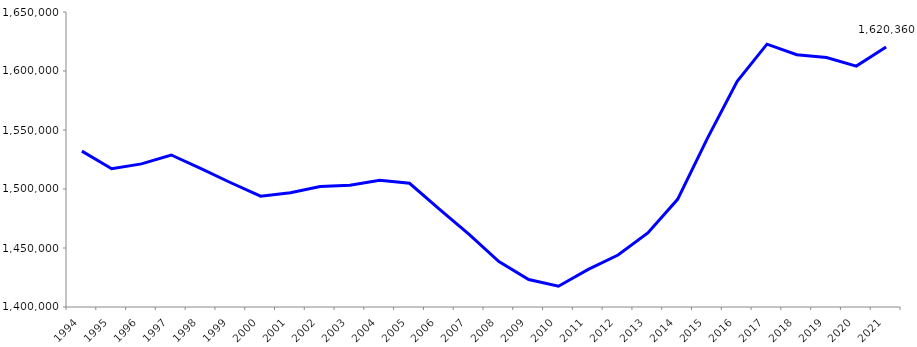
| Category | 1997 |
|---|---|
| 1994 | 1532117 |
| 1995 | 1517133 |
| 1996 | 1521263 |
| 1997 | 1528818 |
| 1998 | 1517182 |
| 1999 | 1505298 |
| 2000 | 1493869 |
| 2001 | 1496811 |
| 2002 | 1502152 |
| 2003 | 1503267 |
| 2004 | 1507439 |
| 2005 | 1504878 |
| 2006 | 1483015 |
| 2007 | 1461505 |
| 2008 | 1438506 |
| 2009 | 1423264 |
| 2010 | 1417634 |
| 2011 | 1431834 |
| 2012 | 1444067 |
| 2013 | 1462735 |
| 2014 | 1491243 |
| 2015 | 1542895 |
| 2016 | 1591190 |
| 2017 | 1622741 |
| 2018 | 1613814 |
| 2019 | 1611464 |
| 2020 | 1604158 |
| 2021 | 1620360 |